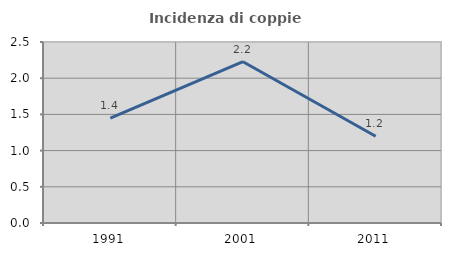
| Category | Incidenza di coppie miste |
|---|---|
| 1991.0 | 1.449 |
| 2001.0 | 2.227 |
| 2011.0 | 1.198 |